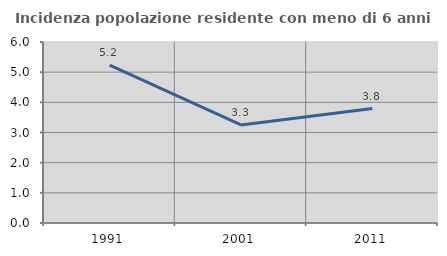
| Category | Incidenza popolazione residente con meno di 6 anni |
|---|---|
| 1991.0 | 5.233 |
| 2001.0 | 3.25 |
| 2011.0 | 3.793 |